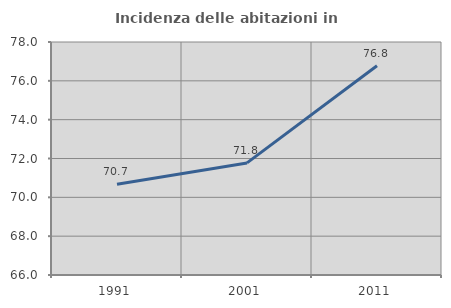
| Category | Incidenza delle abitazioni in proprietà  |
|---|---|
| 1991.0 | 70.673 |
| 2001.0 | 71.772 |
| 2011.0 | 76.778 |